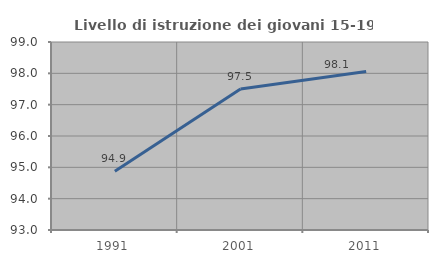
| Category | Livello di istruzione dei giovani 15-19 anni |
|---|---|
| 1991.0 | 94.872 |
| 2001.0 | 97.5 |
| 2011.0 | 98.058 |